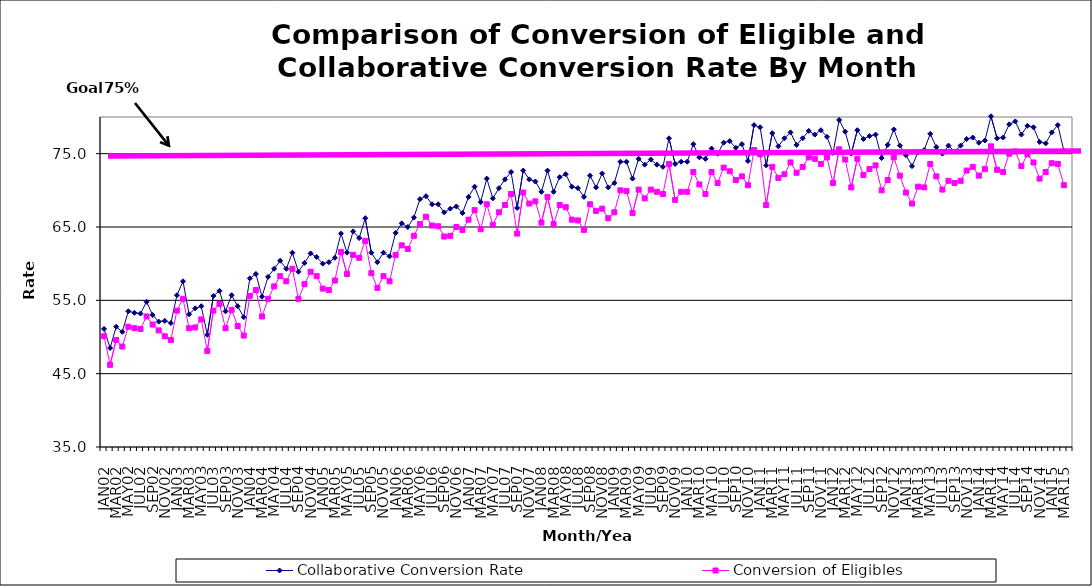
| Category | Collaborative Conversion Rate | Conversion of Eligibles |
|---|---|---|
| JAN02 | 51.1 | 50.1 |
| FEB02 | 48.5 | 46.2 |
| MAR02 | 51.4 | 49.6 |
| APR02 | 50.7 | 48.7 |
| MAY02 | 53.5 | 51.4 |
| JUN02 | 53.3 | 51.2 |
| JUL02 | 53.2 | 51.1 |
| AUG02 | 54.8 | 52.8 |
| SEP02 | 53 | 51.7 |
| OCT02 | 52.1 | 50.9 |
| NOV02 | 52.2 | 50.1 |
| DEC02 | 51.9 | 49.6 |
| JAN03 | 55.7 | 53.6 |
| FEB03 | 57.6 | 55.2 |
| MAR03 | 53.1 | 51.2 |
| APR03 | 53.9 | 51.3 |
| MAY03 | 54.2 | 52.4 |
| JUN03 | 50.3 | 48.1 |
| JUL03 | 55.6 | 53.6 |
| AUG03 | 56.3 | 54.5 |
| SEP03 | 53.5 | 51.2 |
| OCT03 | 55.7 | 53.7 |
| NOV03 | 54.2 | 51.5 |
| DEC03 | 52.7 | 50.2 |
| JAN04 | 58 | 55.6 |
| FEB04 | 58.6 | 56.4 |
| MAR04 | 55.5 | 52.8 |
| APR04 | 58.2 | 55.2 |
| MAY04 | 59.3 | 56.9 |
| JUN04 | 60.4 | 58.3 |
| JUL04 | 59.3 | 57.6 |
| AUG04 | 61.5 | 59.3 |
| SEP04 | 58.9 | 55.2 |
| OCT04 | 60.1 | 57.2 |
| NOV04 | 61.4 | 58.9 |
| DEC04 | 60.9 | 58.3 |
| JAN05 | 60 | 56.6 |
| FEB05 | 60.2 | 56.4 |
| MAR05 | 60.8 | 57.7 |
| APR05 | 64.1 | 61.6 |
| MAY05 | 61.5 | 58.6 |
| JUN05 | 64.4 | 61.2 |
| JUL05 | 63.5 | 60.8 |
| AUG05 | 66.2 | 63.1 |
| SEP05 | 61.5 | 58.7 |
| OCT05 | 60.2 | 56.7 |
| NOV05 | 61.5 | 58.3 |
| DEC05 | 61 | 57.6 |
| JAN06 | 64.2 | 61.2 |
| FEB06 | 65.5 | 62.5 |
| MAR06 | 65 | 62 |
| APR06 | 66.3 | 63.8 |
| MAY06 | 68.8 | 65.4 |
| JUN06 | 69.2 | 66.4 |
| JUL06 | 68.1 | 65.2 |
| AUG06 | 68.1 | 65.1 |
| SEP06 | 67 | 63.7 |
| OCT06 | 67.5 | 63.8 |
| NOV06 | 67.8 | 65 |
| DEC06 | 66.9 | 64.6 |
| JAN07 | 69.1 | 66 |
| FEB07 | 70.5 | 67.3 |
| MAR07 | 68.4 | 64.7 |
| APR07 | 71.6 | 68.1 |
| MAY07 | 68.9 | 65.3 |
| JUN07 | 70.3 | 67 |
| JUL07 | 71.5 | 68 |
| AUG07 | 72.5 | 69.5 |
| SEP07 | 67.6 | 64.1 |
| OCT07 | 72.7 | 69.7 |
| NOV07 | 71.5 | 68.2 |
| DEC07 | 71.2 | 68.5 |
| JAN08 | 69.8 | 65.6 |
| FEB08 | 72.7 | 69.1 |
| MAR08 | 69.8 | 65.4 |
| APR08 | 71.8 | 68 |
| MAY08 | 72.2 | 67.7 |
| JUN08 | 70.5 | 66 |
| JUL08 | 70.3 | 65.9 |
| AUG08 | 69.1 | 64.6 |
| SEP08 | 72 | 68.1 |
| OCT08 | 70.4 | 67.2 |
| NOV08 | 72.3 | 67.5 |
| DEC08 | 70.4 | 66.2 |
| JAN09 | 71 | 67 |
| FEB09 | 73.9 | 70 |
| MAR09 | 73.9 | 69.9 |
| APR09 | 71.6 | 66.9 |
| MAY09 | 74.3 | 70.1 |
| JUN09 | 73.5 | 68.9 |
| JUL09 | 74.2 | 70.1 |
| AUG09 | 73.5 | 69.8 |
| SEP09 | 73.2 | 69.5 |
| OCT09 | 77.1 | 73.6 |
| NOV09 | 73.6 | 68.7 |
| DEC09 | 73.9 | 69.8 |
| JAN10 | 73.9 | 69.8 |
| FEB10 | 76.3 | 72.5 |
| MAR10 | 74.5 | 70.8 |
| APR10 | 74.3 | 69.5 |
| MAY10 | 75.7 | 72.5 |
| JUN10 | 75 | 71 |
| JUL10 | 76.5 | 73.1 |
| AUG10 | 76.7 | 72.6 |
| SEP10 | 75.8 | 71.4 |
| OCT10 | 76.3 | 71.9 |
| NOV10 | 74 | 70.7 |
| DEC10 | 78.9 | 75.5 |
| JAN11 | 78.6 | 74.9 |
| FEB11 | 73.4 | 68 |
| MAR11 | 77.8 | 73.2 |
| APR11 | 76 | 71.7 |
| MAY11 | 77.1 | 72.2 |
| JUN11 | 77.9 | 73.8 |
| JUL11 | 76.2 | 72.4 |
| AUG11 | 77.1 | 73.2 |
| SEP11 | 78.1 | 74.5 |
| OCT11 | 77.6 | 74.3 |
| NOV11 | 78.2 | 73.6 |
| DEC11 | 77.3 | 74.5 |
| JAN12 | 75.1 | 71 |
| FEB12 | 79.6 | 75.6 |
| MAR12 | 78 | 74.2 |
| APR12 | 75 | 70.4 |
| MAY12 | 78.2 | 74.3 |
| JUN12 | 77 | 72.1 |
| JUL12 | 77.4 | 72.9 |
| AUG12 | 77.6 | 73.4 |
| SEP12 | 74.4 | 70 |
| OCT12 | 76.2 | 71.4 |
| NOV12 | 78.3 | 74.5 |
| DEC12 | 76.1 | 72 |
| JAN13 | 74.8 | 69.7 |
| FEB13 | 73.3 | 68.2 |
| MAR13 | 75.2 | 70.5 |
| APR13 | 75.5 | 70.4 |
| MAY13 | 77.7 | 73.6 |
| JUN13 | 75.9 | 71.9 |
| JUL13 | 75 | 70.1 |
| AUG13 | 76.1 | 71.3 |
| SEP13 | 75.3 | 71 |
| OCT13 | 76.1 | 71.3 |
| NOV13 | 77 | 72.7 |
| DEC13 | 77.2 | 73.2 |
| JAN14 | 76.5 | 72 |
| FEB14 | 76.8 | 72.9 |
| MAR14 | 80.1 | 76 |
| APR14 | 77.1 | 72.8 |
| MAY14 | 77.2 | 72.5 |
| JUN14 | 79 | 75 |
| JUL14 | 79.4 | 75.3 |
| AUG14 | 77.6 | 73.3 |
| SEP14 | 78.8 | 74.9 |
| OCT14 | 78.6 | 73.8 |
| NOV14 | 76.6 | 71.6 |
| DEC14 | 76.4 | 72.5 |
| JAN15 | 77.9 | 73.7 |
| FEB15 | 78.9 | 73.6 |
| MAR15 | 75.4 | 70.7 |